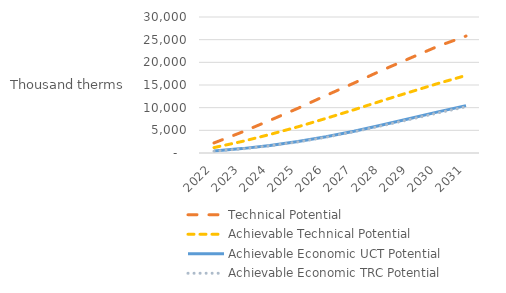
| Category | Technical Potential | Achievable Technical Potential | Achievable Economic UCT Potential | Achievable Economic TRC Potential |
|---|---|---|---|---|
| 2022.0 | 2219.999 | 1193.081 | 419.461 | 389.989 |
| 2023.0 | 4608.113 | 2541.158 | 967.165 | 911.603 |
| 2024.0 | 7206.344 | 4094.995 | 1671.884 | 1592.754 |
| 2025.0 | 9867.383 | 5782.979 | 2533.596 | 2436.105 |
| 2026.0 | 12697.075 | 7633.823 | 3600.492 | 3483.1 |
| 2027.0 | 15424.733 | 9539.412 | 4817.7 | 4680.025 |
| 2028.0 | 18254.094 | 11528.733 | 6189.163 | 6021.815 |
| 2029.0 | 20910.603 | 13440.8 | 7604.399 | 7409.675 |
| 2030.0 | 23553.783 | 15340.545 | 9064.754 | 8839.925 |
| 2031.0 | 25792.65 | 17102.375 | 10458.266 | 10203.168 |